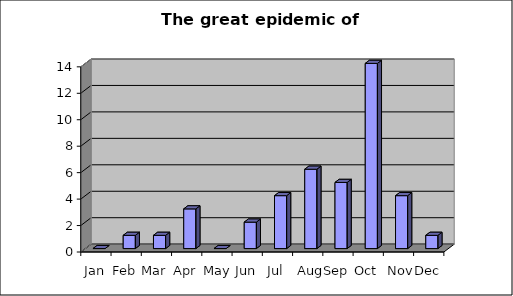
| Category | Series 0 |
|---|---|
| Jan | 0 |
| Feb | 1 |
| Mar | 1 |
| Apr | 3 |
| May | 0 |
| Jun | 2 |
| Jul | 4 |
| Aug | 6 |
| Sep | 5 |
| Oct | 14 |
| Nov | 4 |
| Dec | 1 |